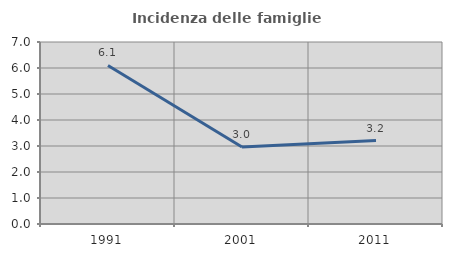
| Category | Incidenza delle famiglie numerose |
|---|---|
| 1991.0 | 6.098 |
| 2001.0 | 2.959 |
| 2011.0 | 3.209 |